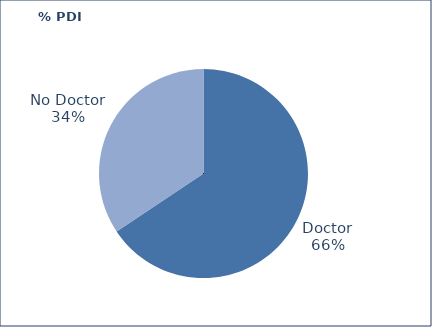
| Category | Series 0 |
|---|---|
| Doctor | 1642 |
| No Doctor | 860 |